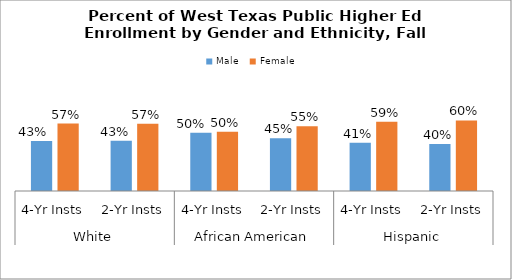
| Category | Male | Female |
|---|---|---|
| 0 | 0.426 | 0.574 |
| 1 | 0.427 | 0.573 |
| 2 | 0.496 | 0.504 |
| 3 | 0.449 | 0.551 |
| 4 | 0.411 | 0.589 |
| 5 | 0.4 | 0.6 |